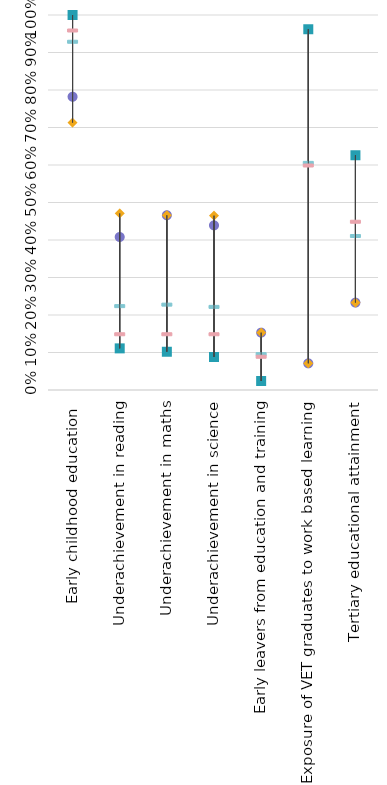
| Category | Romania | Strongest performer | Weakest performer | EU average | EU target |
|---|---|---|---|---|---|
| Early childhood education  | 0.782 | 1 | 0.713 | 0.93 | 0.96 |
| Underachievement in reading | 0.408 | 0.111 | 0.471 | 0.225 | 0.15 |
| Underachievement in maths | 0.466 | 0.102 | 0.466 | 0.229 | 0.15 |
| Underachievement in science | 0.439 | 0.088 | 0.465 | 0.223 | 0.15 |
| Early leavers from education and training | 0.153 | 0.024 | 0.153 | 0.097 | 0.09 |
| Exposure of VET graduates to work based learning  | 0.071 | 0.962 | 0.071 | 0.607 | 0.6 |
| Tertiary educational attainment | 0.233 | 0.626 | 0.233 | 0.412 | 0.45 |